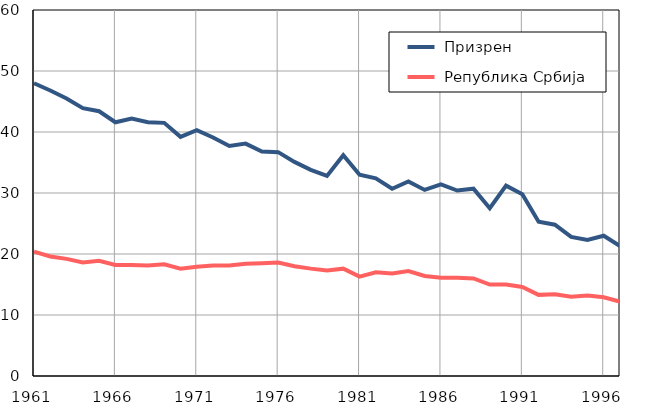
| Category |  Призрен |  Република Србија |
|---|---|---|
| 1961.0 | 48 | 20.4 |
| 1962.0 | 46.8 | 19.6 |
| 1963.0 | 45.5 | 19.2 |
| 1964.0 | 43.9 | 18.6 |
| 1965.0 | 43.4 | 18.9 |
| 1966.0 | 41.6 | 18.2 |
| 1967.0 | 42.2 | 18.2 |
| 1968.0 | 41.6 | 18.1 |
| 1969.0 | 41.5 | 18.3 |
| 1970.0 | 39.2 | 17.6 |
| 1971.0 | 40.3 | 17.9 |
| 1972.0 | 39.1 | 18.1 |
| 1973.0 | 37.7 | 18.1 |
| 1974.0 | 38.1 | 18.4 |
| 1975.0 | 36.8 | 18.5 |
| 1976.0 | 36.7 | 18.6 |
| 1977.0 | 35.1 | 18 |
| 1978.0 | 33.8 | 17.6 |
| 1979.0 | 32.8 | 17.3 |
| 1980.0 | 36.2 | 17.6 |
| 1981.0 | 33 | 16.3 |
| 1982.0 | 32.4 | 17 |
| 1983.0 | 30.7 | 16.8 |
| 1984.0 | 31.9 | 17.2 |
| 1985.0 | 30.5 | 16.4 |
| 1986.0 | 31.4 | 16.1 |
| 1987.0 | 30.4 | 16.1 |
| 1988.0 | 30.7 | 16 |
| 1989.0 | 27.5 | 15 |
| 1990.0 | 31.2 | 15 |
| 1991.0 | 29.8 | 14.6 |
| 1992.0 | 25.3 | 13.3 |
| 1993.0 | 24.8 | 13.4 |
| 1994.0 | 22.8 | 13 |
| 1995.0 | 22.3 | 13.2 |
| 1996.0 | 23 | 12.9 |
| 1997.0 | 21.3 | 12.2 |